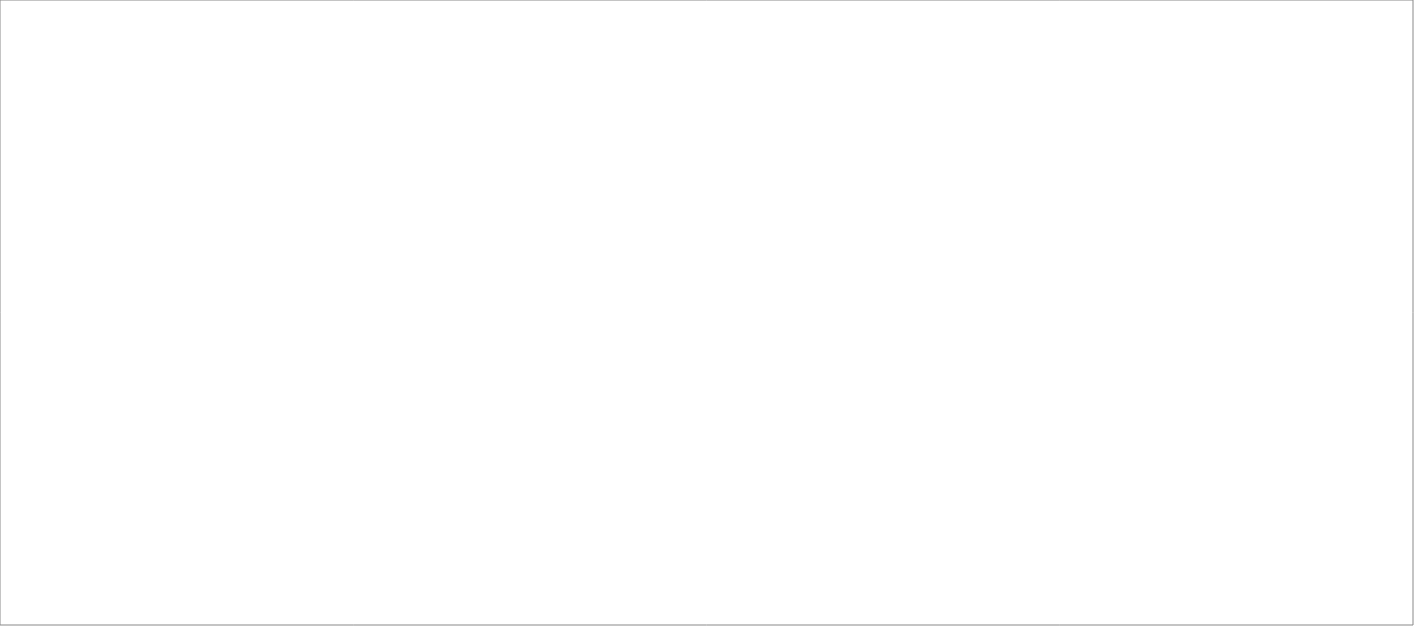
| Category | Total |
|---|---|
| Poolia Sverige AB | 85 |
| AB Effektiv Borås AB | 85 |
| Randstad AB | 80 |
| Tarasso AB | 65 |
| Experis AB | 45 |